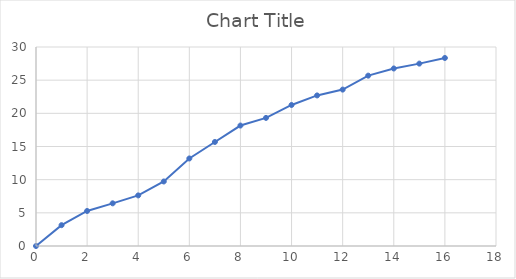
| Category | Series 0 |
|---|---|
| 0.0 | 0 |
| 1.0 | 3.141 |
| 2.0 | 5.279 |
| 3.0 | 6.432 |
| 4.0 | 7.628 |
| 5.0 | 9.727 |
| 6.0 | 13.196 |
| 7.0 | 15.681 |
| 8.0 | 18.16 |
| 9.0 | 19.312 |
| 10.0 | 21.26 |
| 11.0 | 22.699 |
| 12.0 | 23.578 |
| 13.0 | 25.681 |
| 14.0 | 26.762 |
| 15.0 | 27.495 |
| 16.0 | 28.345 |